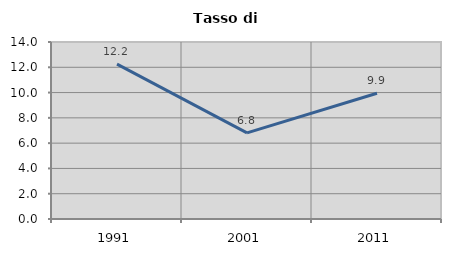
| Category | Tasso di disoccupazione   |
|---|---|
| 1991.0 | 12.245 |
| 2001.0 | 6.811 |
| 2011.0 | 9.949 |